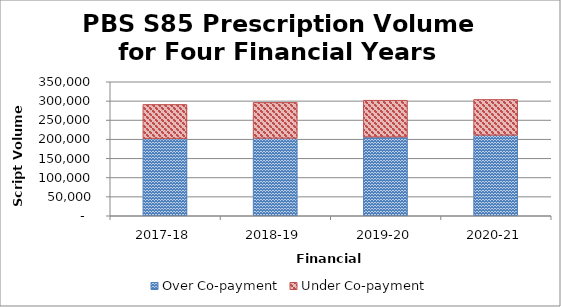
| Category | Over Co‐payment | Under Co‐payment |
|---|---|---|
| 2017-18 | 201433842 | 89436834 |
| 2018-19 | 202303105 | 93869122 |
| 2019-20 | 205490328 | 96326008 |
| 2020-21 | 210324278 | 93537811 |